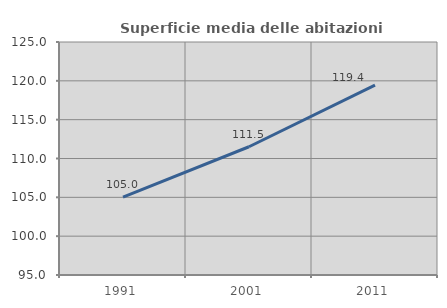
| Category | Superficie media delle abitazioni occupate |
|---|---|
| 1991.0 | 105.017 |
| 2001.0 | 111.513 |
| 2011.0 | 119.439 |